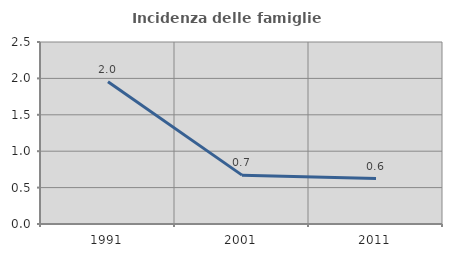
| Category | Incidenza delle famiglie numerose |
|---|---|
| 1991.0 | 1.953 |
| 2001.0 | 0.671 |
| 2011.0 | 0.625 |